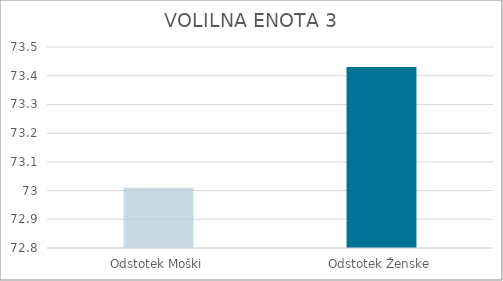
| Category | Series 0 |
|---|---|
| Odstotek Moški | 73.01 |
| Odstotek Ženske | 73.43 |